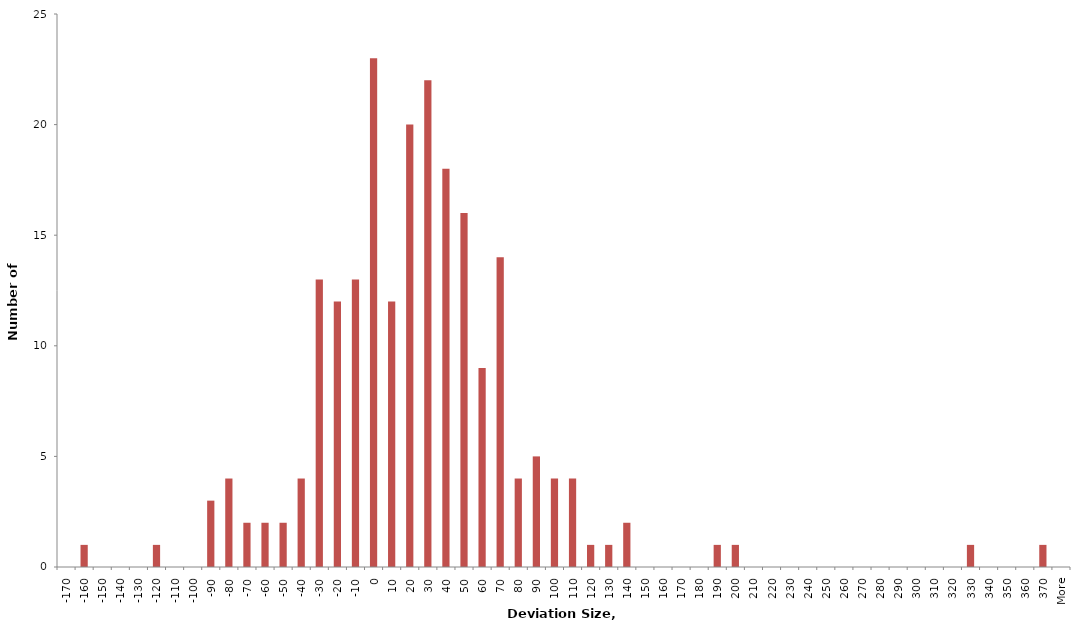
| Category | Frequency |
|---|---|
| -170 | 0 |
| -160 | 1 |
| -150 | 0 |
| -140 | 0 |
| -130 | 0 |
| -120 | 1 |
| -110 | 0 |
| -100 | 0 |
| -90 | 3 |
| -80 | 4 |
| -70 | 2 |
| -60 | 2 |
| -50 | 2 |
| -40 | 4 |
| -30 | 13 |
| -20 | 12 |
| -10 | 13 |
| 0 | 23 |
| 10 | 12 |
| 20 | 20 |
| 30 | 22 |
| 40 | 18 |
| 50 | 16 |
| 60 | 9 |
| 70 | 14 |
| 80 | 4 |
| 90 | 5 |
| 100 | 4 |
| 110 | 4 |
| 120 | 1 |
| 130 | 1 |
| 140 | 2 |
| 150 | 0 |
| 160 | 0 |
| 170 | 0 |
| 180 | 0 |
| 190 | 1 |
| 200 | 1 |
| 210 | 0 |
| 220 | 0 |
| 230 | 0 |
| 240 | 0 |
| 250 | 0 |
| 260 | 0 |
| 270 | 0 |
| 280 | 0 |
| 290 | 0 |
| 300 | 0 |
| 310 | 0 |
| 320 | 0 |
| 330 | 1 |
| 340 | 0 |
| 350 | 0 |
| 360 | 0 |
| 370 | 1 |
| More | 0 |